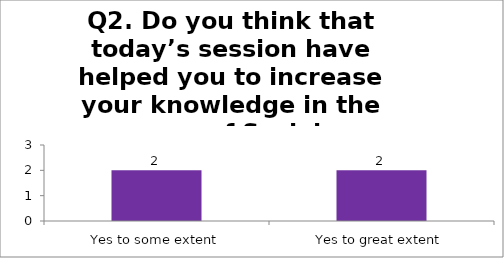
| Category | Q2. Do you think that today’s session have helped you to increase your knowledge in the area of Social Entrepreneurship? |
|---|---|
| Yes to some extent | 2 |
| Yes to great extent | 2 |